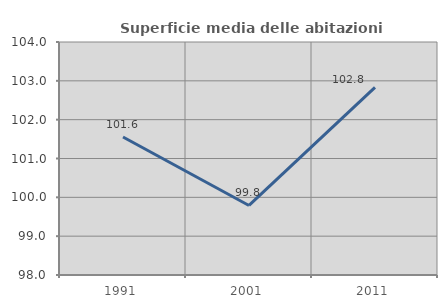
| Category | Superficie media delle abitazioni occupate |
|---|---|
| 1991.0 | 101.554 |
| 2001.0 | 99.791 |
| 2011.0 | 102.83 |